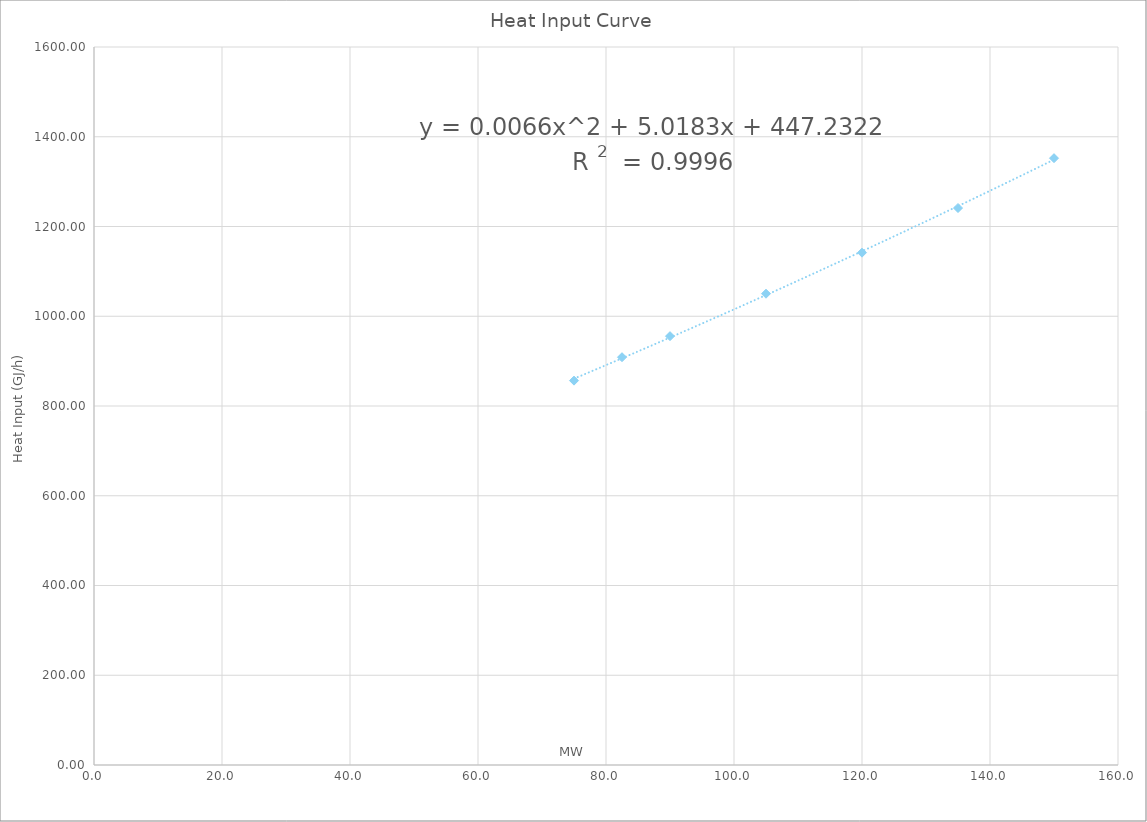
| Category | Series 0 |
|---|---|
| 150.0 | 1352.25 |
| 135.0 | 1241.19 |
| 120.0 | 1141.68 |
| 105.0 | 1050.21 |
| 90.0 | 955.62 |
| 82.5 | 908.738 |
| 75.0 | 856.536 |